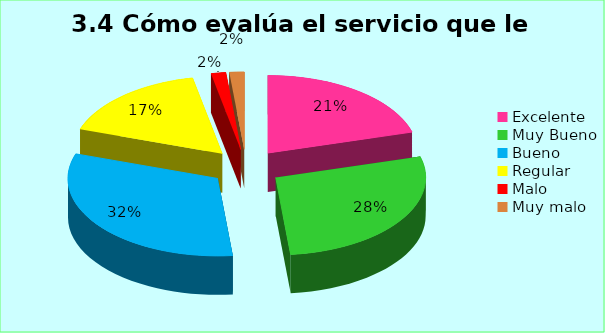
| Category | Series 0 |
|---|---|
| Excelente | 0.206 |
| Muy Bueno | 0.278 |
| Bueno  | 0.317 |
| Regular  | 0.167 |
| Malo  | 0.016 |
| Muy malo  | 0.016 |